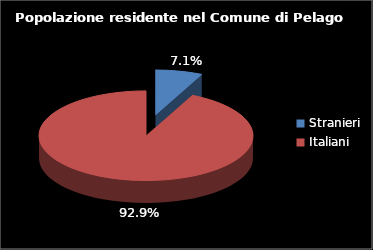
| Category | Series 0 |
|---|---|
| Stranieri | 550 |
| Italiani | 7203 |